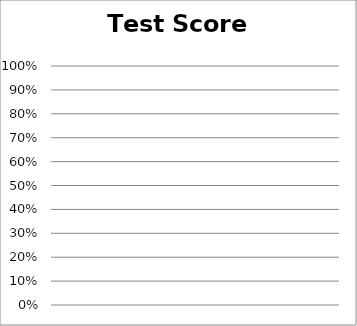
| Category | opening price | high price | low price | closing price |
|---|---|---|---|---|
| 9/10/14 | 0 | 0 | 0 | 0 |